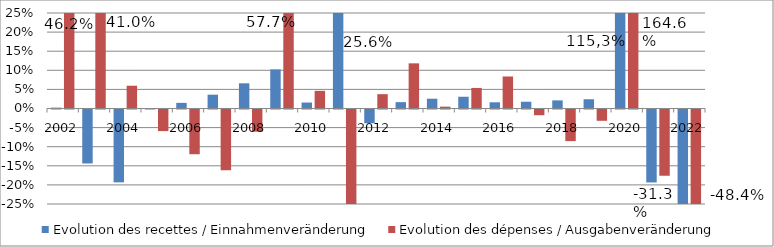
| Category | Evolution des recettes / Einnahmenveränderung | Evolution des dépenses / Ausgabenveränderung |
|---|---|---|
| 2002.0 | 0.002 | 0.462 |
| 2003.0 | -0.141 | 0.41 |
| 2004.0 | -0.191 | 0.06 |
| 2005.0 | 0.001 | -0.057 |
| 2006.0 | 0.015 | -0.117 |
| 2007.0 | 0.036 | -0.159 |
| 2008.0 | 0.066 | -0.058 |
| 2009.0 | 0.102 | 0.577 |
| 2010.0 | 0.016 | 0.046 |
| 2011.0 | 0.256 | -0.25 |
| 2012.0 | -0.036 | 0.038 |
| 2013.0 | 0.017 | 0.118 |
| 2014.0 | 0.026 | 0.005 |
| 2015.0 | 0.031 | 0.054 |
| 2016.0 | 0.016 | 0.084 |
| 2017.0 | 0.018 | -0.015 |
| 2018.0 | 0.021 | -0.083 |
| 2019.0 | 0.024 | -0.03 |
| 2020.0 | 1.153 | 1.646 |
| 2021.0 | -0.191 | -0.173 |
| 2022.0 | -0.313 | -0.484 |